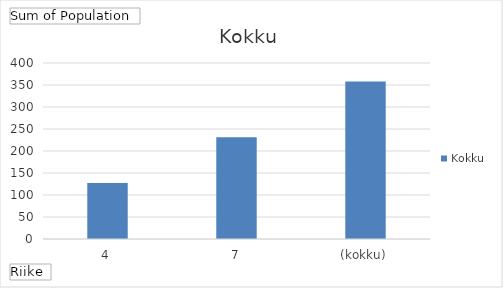
| Category | Series 0 |
|---|---|
| 0 | 127 |
| 1 | 231 |
| 2 | 358 |